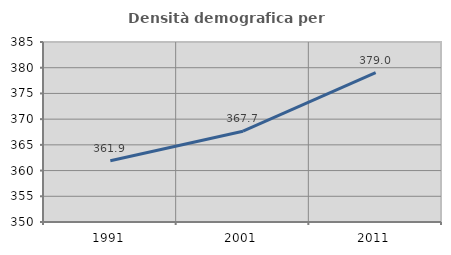
| Category | Densità demografica |
|---|---|
| 1991.0 | 361.904 |
| 2001.0 | 367.654 |
| 2011.0 | 379.043 |